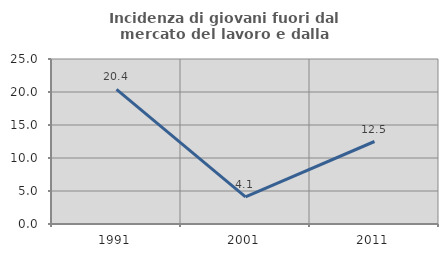
| Category | Incidenza di giovani fuori dal mercato del lavoro e dalla formazione  |
|---|---|
| 1991.0 | 20.388 |
| 2001.0 | 4.11 |
| 2011.0 | 12.5 |